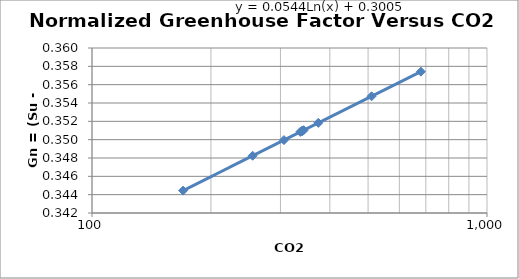
| Category | Series 0 |
|---|---|
| 170.06723749999998 | 0.344 |
| 255.10085 | 0.348 |
| 306.121025 | 0.35 |
| 336.73312500000003 | 0.351 |
| 339.7943375 | 0.351 |
| 340.10046250000005 | 0.351 |
| 340.1684875 | 0.351 |
| 340.4746 | 0.351 |
| 343.53581249999996 | 0.351 |
| 374.1479125 | 0.352 |
| 510.2017125 | 0.355 |
| 680.2689375 | 0.357 |